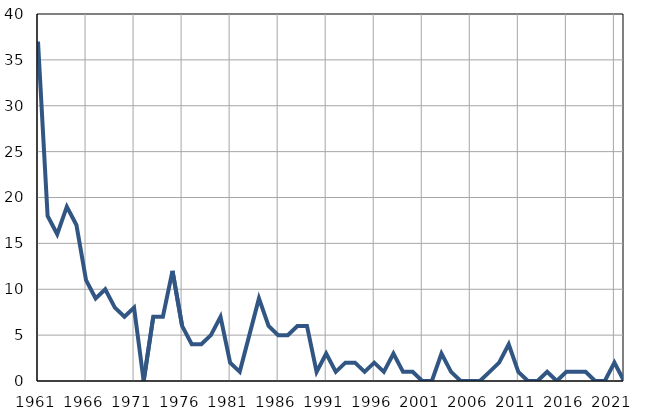
| Category | Infants
deaths |
|---|---|
| 1961.0 | 37 |
| 1962.0 | 18 |
| 1963.0 | 16 |
| 1964.0 | 19 |
| 1965.0 | 17 |
| 1966.0 | 11 |
| 1967.0 | 9 |
| 1968.0 | 10 |
| 1969.0 | 8 |
| 1970.0 | 7 |
| 1971.0 | 8 |
| 1972.0 | 0 |
| 1973.0 | 7 |
| 1974.0 | 7 |
| 1975.0 | 12 |
| 1976.0 | 6 |
| 1977.0 | 4 |
| 1978.0 | 4 |
| 1979.0 | 5 |
| 1980.0 | 7 |
| 1981.0 | 2 |
| 1982.0 | 1 |
| 1983.0 | 5 |
| 1984.0 | 9 |
| 1985.0 | 6 |
| 1986.0 | 5 |
| 1987.0 | 5 |
| 1988.0 | 6 |
| 1989.0 | 6 |
| 1990.0 | 1 |
| 1991.0 | 3 |
| 1992.0 | 1 |
| 1993.0 | 2 |
| 1994.0 | 2 |
| 1995.0 | 1 |
| 1996.0 | 2 |
| 1997.0 | 1 |
| 1998.0 | 3 |
| 1999.0 | 1 |
| 2000.0 | 1 |
| 2001.0 | 0 |
| 2002.0 | 0 |
| 2003.0 | 3 |
| 2004.0 | 1 |
| 2005.0 | 0 |
| 2006.0 | 0 |
| 2007.0 | 0 |
| 2008.0 | 1 |
| 2009.0 | 2 |
| 2010.0 | 4 |
| 2011.0 | 1 |
| 2012.0 | 0 |
| 2013.0 | 0 |
| 2014.0 | 1 |
| 2015.0 | 0 |
| 2016.0 | 1 |
| 2017.0 | 1 |
| 2018.0 | 1 |
| 2019.0 | 0 |
| 2020.0 | 0 |
| 2021.0 | 2 |
| 2022.0 | 0 |